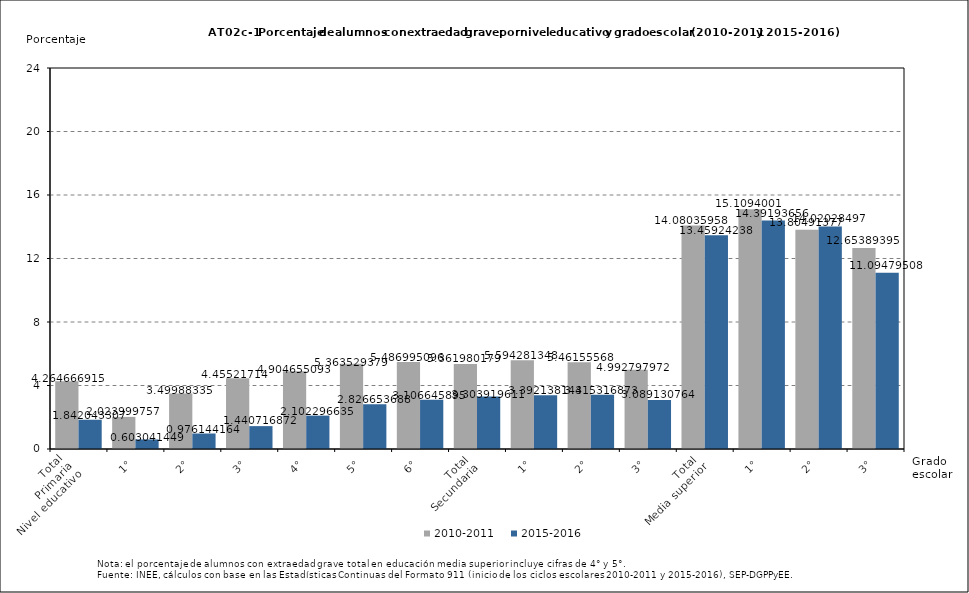
| Category | 2010-2011 | 2015-2016 |
|---|---|---|
| 0 | 4.265 | 1.842 |
| 1 | 2.024 | 0.603 |
| 2 | 3.5 | 0.976 |
| 3 | 4.455 | 1.441 |
| 4 | 4.905 | 2.102 |
| 5 | 5.364 | 2.827 |
| 6 | 5.487 | 3.107 |
| 7 | 5.362 | 3.304 |
| 8 | 5.594 | 3.392 |
| 9 | 5.462 | 3.415 |
| 10 | 4.993 | 3.089 |
| 11 | 14.08 | 13.459 |
| 12 | 15.109 | 14.392 |
| 13 | 13.805 | 14.02 |
| 14 | 12.654 | 11.095 |